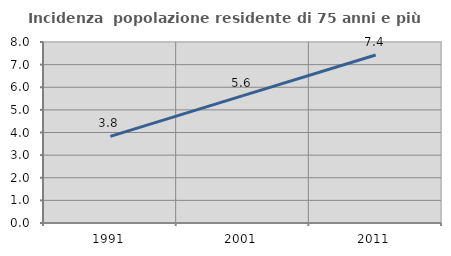
| Category | Incidenza  popolazione residente di 75 anni e più |
|---|---|
| 1991.0 | 3.831 |
| 2001.0 | 5.63 |
| 2011.0 | 7.424 |